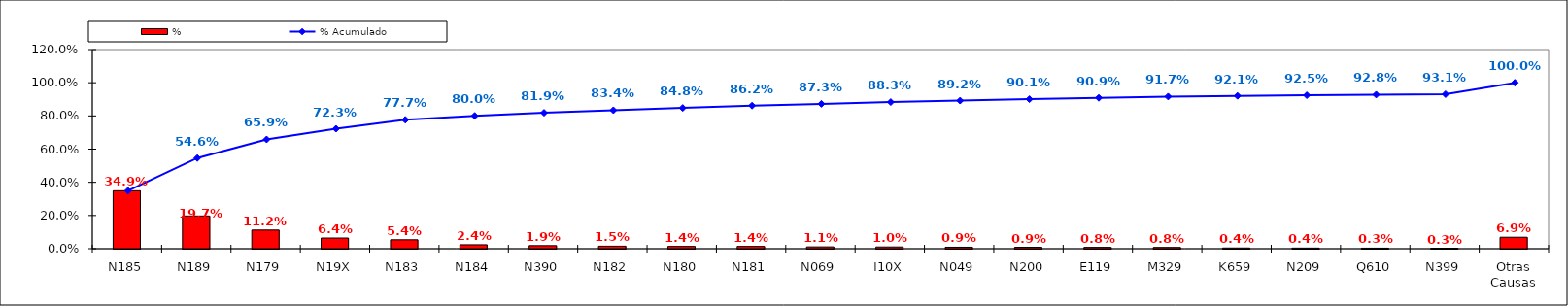
| Category | % |
|---|---|
| N185 | 0.349 |
| N189 | 0.197 |
| N179 | 0.112 |
| N19X | 0.064 |
| N183 | 0.054 |
| N184 | 0.024 |
| N390 | 0.019 |
| N182 | 0.015 |
| N180 | 0.014 |
| N181 | 0.014 |
| N069 | 0.011 |
| I10X | 0.01 |
| N049 | 0.009 |
| N200 | 0.009 |
| E119 | 0.008 |
| M329 | 0.008 |
| K659 | 0.004 |
| N209 | 0.004 |
| Q610 | 0.003 |
| N399 | 0.003 |
| Otras Causas | 0.069 |